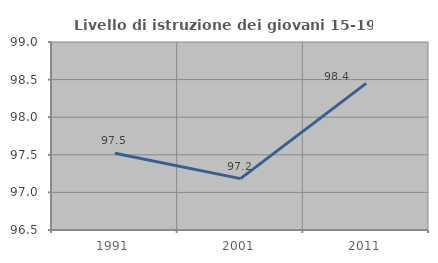
| Category | Livello di istruzione dei giovani 15-19 anni |
|---|---|
| 1991.0 | 97.521 |
| 2001.0 | 97.183 |
| 2011.0 | 98.45 |